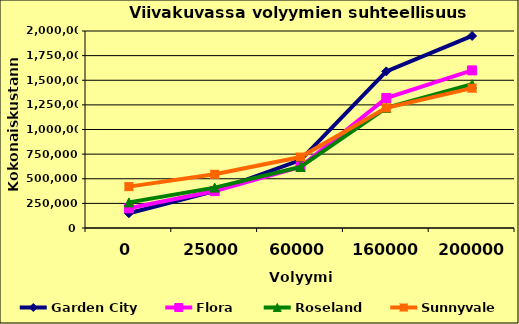
| Category | Garden City | Flora | Roseland | Sunnyvale |
|---|---|---|---|---|
| 0.0 | 150000 | 200000 | 260000 | 420000 |
| 25000.0 | 375000 | 375000 | 410000 | 545000 |
| 60000.0 | 690000 | 620000 | 620000 | 720000 |
| 160000.0 | 1590000 | 1320000 | 1220000 | 1220000 |
| 200000.0 | 1950000 | 1600000 | 1460000 | 1420000 |